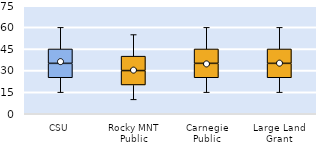
| Category | 25th | 50th | 75th |
|---|---|---|---|
| CSU | 25 | 10 | 10 |
| Rocky MNT Public | 20 | 10 | 10 |
| Carnegie Public | 25 | 10 | 10 |
| Large Land Grant | 25 | 10 | 10 |